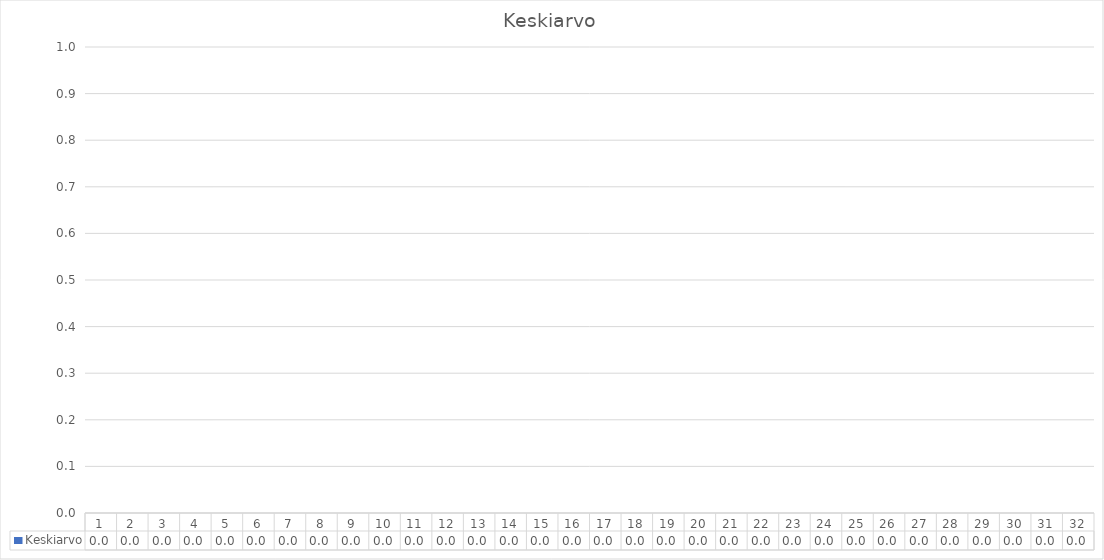
| Category | Keskiarvo |
|---|---|
| 0 | 0 |
| 1 | 0 |
| 2 | 0 |
| 3 | 0 |
| 4 | 0 |
| 5 | 0 |
| 6 | 0 |
| 7 | 0 |
| 8 | 0 |
| 9 | 0 |
| 10 | 0 |
| 11 | 0 |
| 12 | 0 |
| 13 | 0 |
| 14 | 0 |
| 15 | 0 |
| 16 | 0 |
| 17 | 0 |
| 18 | 0 |
| 19 | 0 |
| 20 | 0 |
| 21 | 0 |
| 22 | 0 |
| 23 | 0 |
| 24 | 0 |
| 25 | 0 |
| 26 | 0 |
| 27 | 0 |
| 28 | 0 |
| 29 | 0 |
| 30 | 0 |
| 31 | 0 |